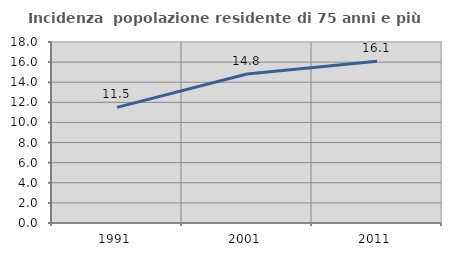
| Category | Incidenza  popolazione residente di 75 anni e più |
|---|---|
| 1991.0 | 11.497 |
| 2001.0 | 14.824 |
| 2011.0 | 16.087 |